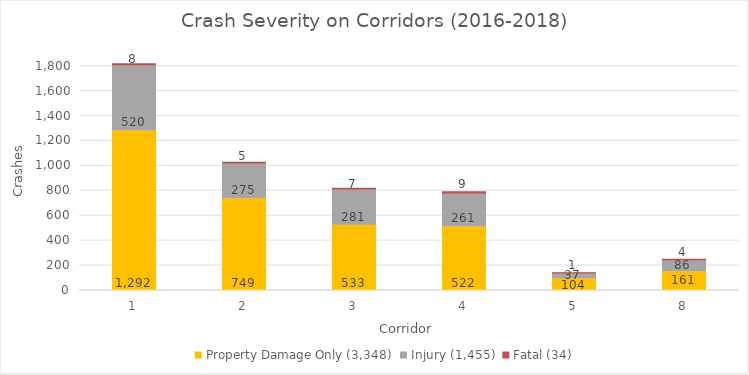
| Category | Property Damage Only (3,348) | Injury (1,455) | Fatal (34) |
|---|---|---|---|
| 1.0 | 1292 | 520 | 8 |
| 2.0 | 749 | 275 | 5 |
| 3.0 | 533 | 281 | 7 |
| 4.0 | 522 | 261 | 9 |
| 5.0 | 104 | 37 | 1 |
| 8.0 | 161 | 86 | 4 |